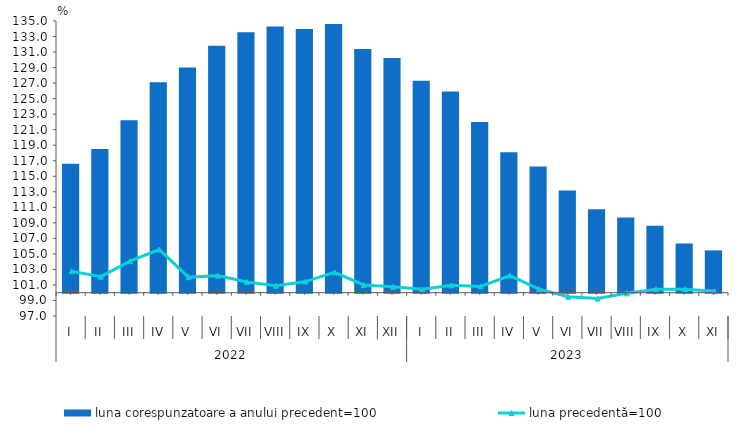
| Category | luna corespunzatoare a anului precedent=100 |
|---|---|
| 0 | 116.6 |
| 1 | 118.5 |
| 2 | 122.2 |
| 3 | 127.1 |
| 4 | 129 |
| 5 | 131.8 |
| 6 | 133.55 |
| 7 | 134.29 |
| 8 | 133.97 |
| 9 | 134.62 |
| 10 | 131.4 |
| 11 | 130.24 |
| 12 | 127.307 |
| 13 | 125.905 |
| 14 | 121.977 |
| 15 | 118.102 |
| 16 | 116.262 |
| 17 | 113.152 |
| 18 | 110.755 |
| 19 | 109.689 |
| 20 | 108.634 |
| 21 | 106.342 |
| 22 | 105.453 |